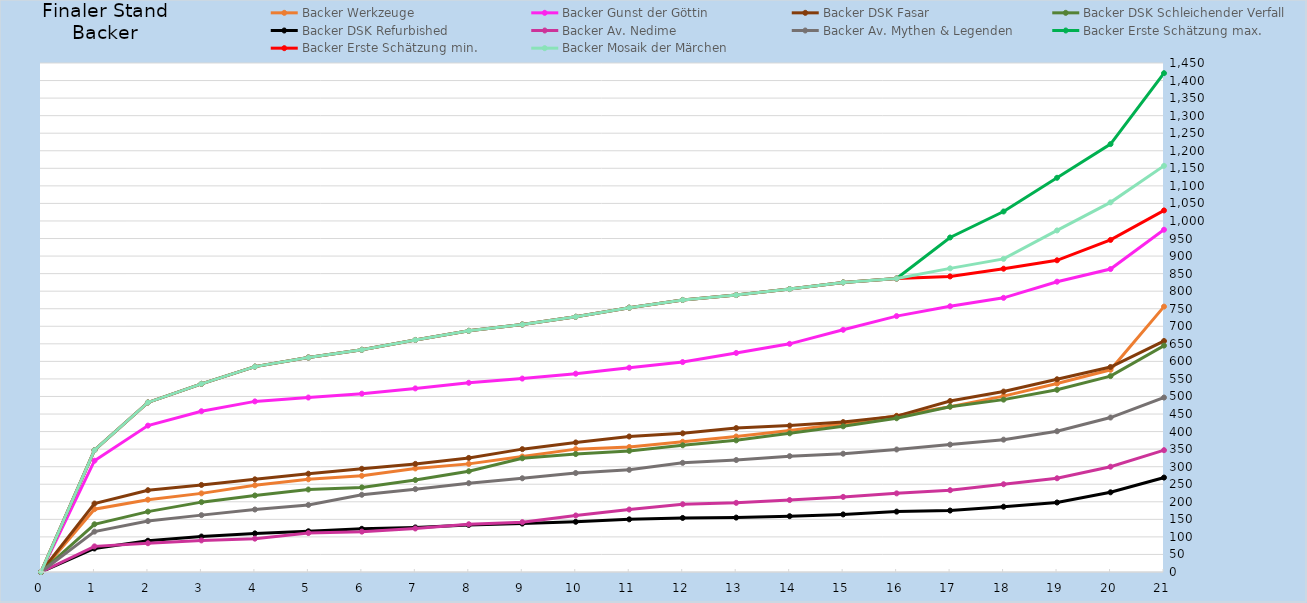
| Category | Backer Thorwal | Backer Werkzeuge | Backer Sonnenküste | Backer Rohals Erben | Backer Gunst der Göttin | Backer Winterwacht | Backer DSK Fasar | Backer DSK Schleichender Verfall | Backer DSK Refurbished | Backer Av. Nedime | Backer Av. Mythen & Legenden | Backer Erste Schätzung max. | Backer Erste Schätzung min. | Backer Mosaik der Märchen |
|---|---|---|---|---|---|---|---|---|---|---|---|---|---|---|
| 0.0 |  | 0 |  |  | 0 |  | 0 | 0 | 0 | 0 | 0 | 0 | 0 | 0 |
| 1.0 |  | 179 |  |  | 317 |  | 195 | 136 | 67 | 73 | 115 | 347 | 347 | 347 |
| 2.0 |  | 206 |  |  | 417 |  | 233 | 172 | 89 | 82 | 145 | 483 | 483 | 483 |
| 3.0 |  | 224 |  |  | 458 |  | 248 | 199 | 101 | 90 | 162 | 536 | 536 | 536 |
| 4.0 |  | 247 |  |  | 486 |  | 264 | 218 | 110 | 95 | 178 | 585 | 585 | 585 |
| 5.0 |  | 264 |  |  | 497 |  | 280 | 235 | 116 | 111 | 191 | 611 | 611 | 611 |
| 6.0 |  | 274 |  |  | 508 |  | 294 | 241 | 123 | 115 | 220 | 633 | 633 | 633 |
| 7.0 |  | 295 |  |  | 523 |  | 308 | 262 | 127 | 124 | 236 | 661 | 661 | 661 |
| 8.0 |  | 308 |  |  | 539 |  | 325 | 287 | 134 | 136 | 253 | 687 | 687 | 687 |
| 9.0 |  | 329 |  |  | 551 |  | 350 | 324 | 138 | 142 | 267 | 705 | 705 | 705 |
| 10.0 |  | 350 |  |  | 565 |  | 369 | 336 | 143 | 161 | 282 | 727 | 727 | 727 |
| 11.0 |  | 356 |  |  | 582 |  | 386 | 345 | 150 | 178 | 291 | 753 | 753 | 753 |
| 12.0 |  | 371 |  |  | 598 |  | 395 | 361 | 154 | 193 | 311 | 775 | 775 | 775 |
| 13.0 |  | 386 |  |  | 624 |  | 410 | 375 | 155 | 197 | 319 | 789 | 789 | 789 |
| 14.0 |  | 403 |  |  | 650 |  | 417 | 395 | 159 | 205 | 330 | 806 | 806 | 806 |
| 15.0 |  | 422 |  |  | 690 |  | 427 | 415 | 164 | 214 | 337 | 825 | 825 | 825 |
| 16.0 |  | 445 |  |  | 729 |  | 444 | 438 | 172 | 224 | 349 | 836 | 836 | 836 |
| 17.0 |  | 471 |  |  | 757 |  | 487 | 471 | 175 | 233 | 363 | 953 | 842 | 865 |
| 18.0 |  | 501 |  |  | 781 |  | 514 | 491 | 186 | 250 | 377 | 1027 | 864 | 892 |
| 19.0 |  | 537 |  |  | 827 |  | 549 | 519 | 198 | 267 | 401 | 1123 | 888 | 973 |
| 20.0 |  | 576 |  |  | 863 |  | 584 | 558 | 227 | 300 | 440 | 1219 | 946 | 1053 |
| 21.0 |  | 756 |  |  | 975 |  | 658 | 645 | 269 | 347 | 497 | 1421 | 1030 | 1157 |